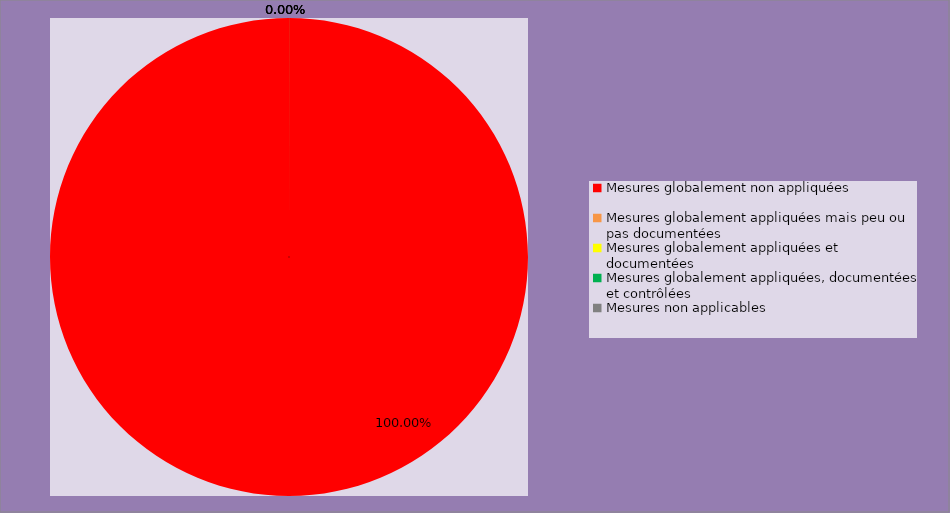
| Category | Series 0 |
|---|---|
| Mesures globalement non appliquées | 165 |
| Mesures globalement appliquées mais peu ou pas documentées | 0 |
| Mesures globalement appliquées et documentées | 0 |
| Mesures globalement appliquées, documentées et contrôlées | 0 |
| Mesures non applicables | 0 |